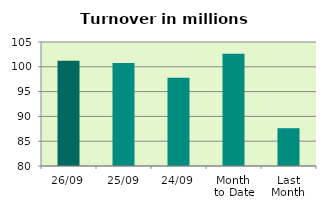
| Category | Series 0 |
|---|---|
| 26/09 | 101.235 |
| 25/09 | 100.763 |
| 24/09 | 97.817 |
| Month 
to Date | 102.627 |
| Last
Month | 87.619 |